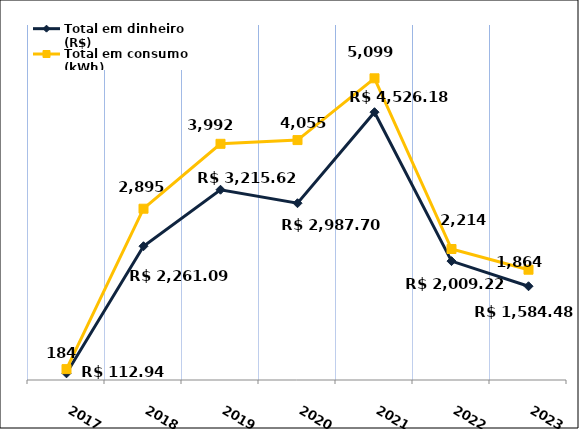
| Category | Total em dinheiro (R$) |
|---|---|
| 2017.0 | 112.94 |
| 2018.0 | 2261.09 |
| 2019.0 | 3215.62 |
| 2020.0 | 2987.7 |
| 2021.0 | 4526.18 |
| 2022.0 | 2009.22 |
| 2023.0 | 1584.48 |